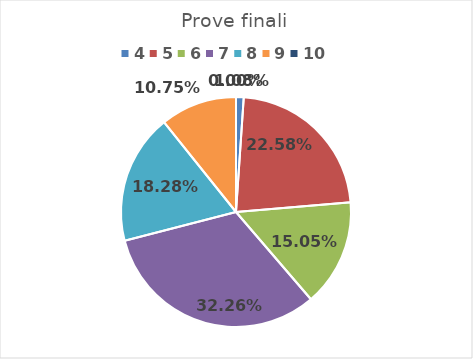
| Category | Series 0 |
|---|---|
| 4.0 | 0.011 |
| 5.0 | 0.226 |
| 6.0 | 0.151 |
| 7.0 | 0.323 |
| 8.0 | 0.183 |
| 9.0 | 0.108 |
| 10.0 | 0 |